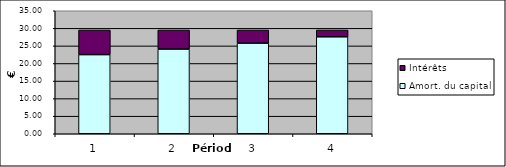
| Category | Amort. du capital | Intérêts |
|---|---|---|
| 0 | 22.523 | 7 |
| 1 | 24.099 | 5.423 |
| 2 | 25.786 | 3.736 |
| 3 | 27.591 | 1.931 |